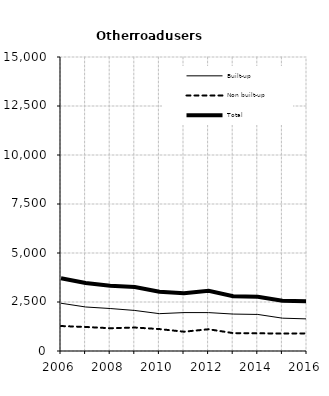
| Category | Built-up | Non built-up | Total |
|---|---|---|---|
| 2006.0 | 2437 | 1274 | 3711 |
| 2007.0 | 2246 | 1226 | 3472 |
| 2008.0 | 2167 | 1162 | 3329 |
| 2009.0 | 2068 | 1197 | 3265 |
| 2010.0 | 1905 | 1119 | 3024 |
| 2011.0 | 1960 | 985 | 2945 |
| 2012.0 | 1959 | 1109 | 3068 |
| 2013.0 | 1884 | 913 | 2797 |
| 2014.0 | 1865 | 905 | 2770 |
| 2015.0 | 1675 | 891 | 2566 |
| 2016.0 | 1638 | 898 | 2536 |